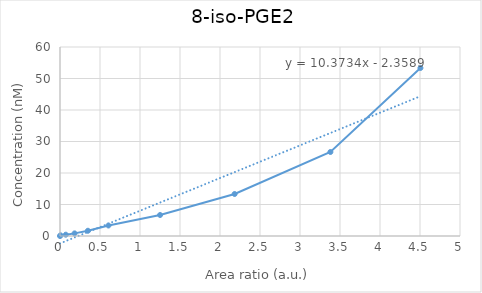
| Category | 8-iso-PGE2 |
|---|---|
| 0.0 | 0 |
| 0.00742727230830425 | 0.208 |
| 0.0724321283586209 | 0.417 |
| 0.182267520304466 | 0.833 |
| 0.348897542403899 | 1.667 |
| 0.605948041225722 | 3.333 |
| 1.25101998559508 | 6.667 |
| 2.18289490073818 | 13.333 |
| 3.38006666048661 | 26.667 |
| 4.50565712846744 | 53.333 |